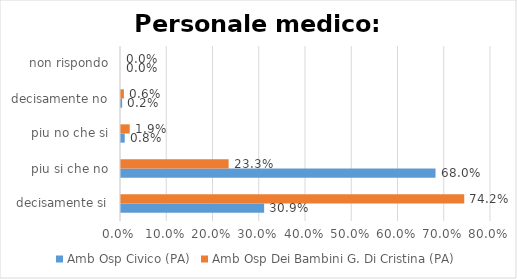
| Category | Amb Osp Civico (PA) | Amb Osp Dei Bambini G. Di Cristina (PA) |
|---|---|---|
| decisamente si | 0.309 | 0.742 |
| piu si che no | 0.68 | 0.233 |
| piu no che si | 0.008 | 0.019 |
| decisamente no | 0.002 | 0.006 |
| non rispondo | 0 | 0 |